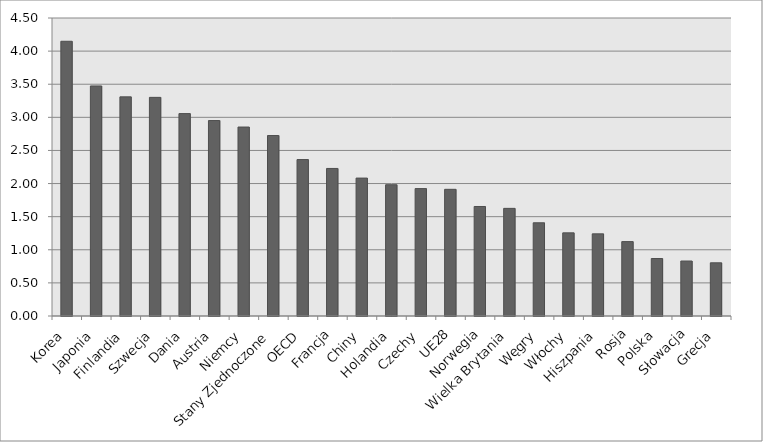
| Category | GERD (%PKB) |
|---|---|
| Korea | 4.149 |
| Japonia | 3.474 |
| Finlandia | 3.309 |
| Szwecja | 3.302 |
| Dania | 3.056 |
| Austria | 2.951 |
| Niemcy | 2.853 |
| Stany Zjednoczone | 2.725 |
| OECD | 2.362 |
| Francja | 2.228 |
| Chiny | 2.083 |
| Holandia | 1.982 |
| Czechy | 1.924 |
| UE28 | 1.913 |
| Norwegia | 1.654 |
| Wielka Brytania | 1.625 |
| Węgry | 1.408 |
| Włochy | 1.255 |
| Hiszpania | 1.24 |
| Rosja | 1.123 |
| Polska | 0.868 |
| Słowacja | 0.83 |
| Grecja | 0.803 |